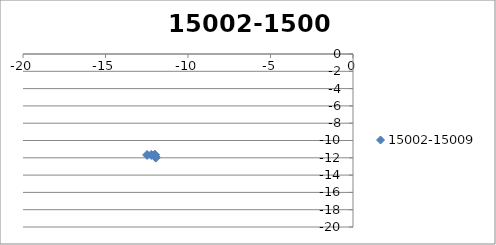
| Category | 15002-15009 |
|---|---|
| -12.013319302465424 | -11.666 |
| -12.013319302465424 | -11.666 |
| -12.013319302465424 | -11.666 |
| -12.013319302465424 | -11.821 |
| -12.223060733613952 | -11.666 |
| -12.47793144918821 | -11.666 |
| -12.013319302465424 | -11.821 |
| -11.953577871316893 | -11.976 |